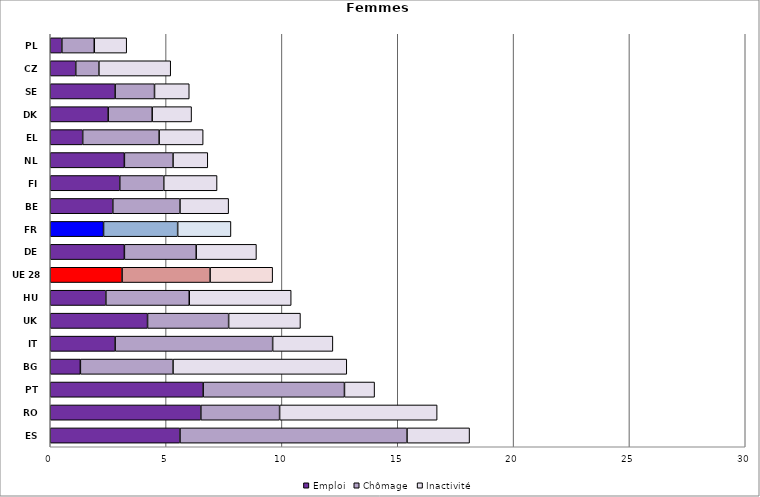
| Category | Emploi | Chômage | Inactivité |
|---|---|---|---|
| ES | 5.6 | 9.8 | 2.7 |
| RO | 6.5 | 3.4 | 6.8 |
| PT | 6.6 | 6.1 | 1.3 |
| BG | 1.3 | 4 | 7.5 |
| IT | 2.8 | 6.8 | 2.6 |
| UK | 4.2 | 3.5 | 3.1 |
| HU | 2.4 | 3.6 | 4.4 |
| UE 28 | 3.1 | 3.8 | 2.7 |
| DE | 3.2 | 3.1 | 2.6 |
| FR | 2.3 | 3.2 | 2.3 |
| BE | 2.7 | 2.9 | 2.1 |
| FI | 3 | 1.9 | 2.3 |
| NL | 3.2 | 2.1 | 1.5 |
| EL | 1.4 | 3.3 | 1.9 |
| DK | 2.5 | 1.9 | 1.7 |
| SE | 2.8 | 1.7 | 1.5 |
| CZ | 1.1 | 1 | 3.1 |
| PL | 0.5 | 1.4 | 1.4 |